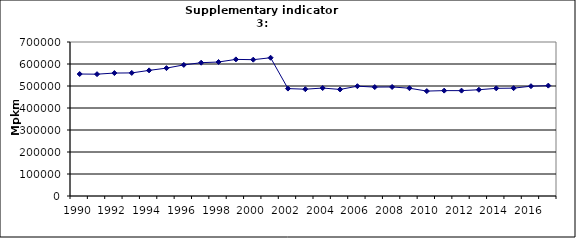
| Category | Passenger transport by cars, Mpkm |
|---|---|
| 1990 | 554446.844 |
| 1991 | 553715.364 |
| 1992 | 558844.084 |
| 1993 | 559476.779 |
| 1994 | 571018.077 |
| 1995 | 581231.361 |
| 1996 | 595924.825 |
| 1997 | 605941.938 |
| 1998 | 609086.786 |
| 1999 | 620975.331 |
| 2000 | 619612.492 |
| 2001 | 628462.659 |
| 2002 | 488261.94 |
| 2003 | 485387.465 |
| 2004 | 490756.665 |
| 2005 | 484353.61 |
| 2006 | 499145.745 |
| 2007 | 495034.81 |
| 2008 | 495643.295 |
| 2009 | 489976.816 |
| 2010 | 476881.185 |
| 2011 | 478999.54 |
| 2012 | 478946.687 |
| 2013 | 483021.688 |
| 2014 | 489387.799 |
| 2015 | 490205.412 |
| 2016 | 499092.6 |
| 2017 | 501760.639 |